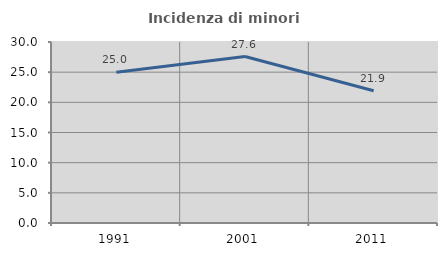
| Category | Incidenza di minori stranieri |
|---|---|
| 1991.0 | 25 |
| 2001.0 | 27.586 |
| 2011.0 | 21.93 |